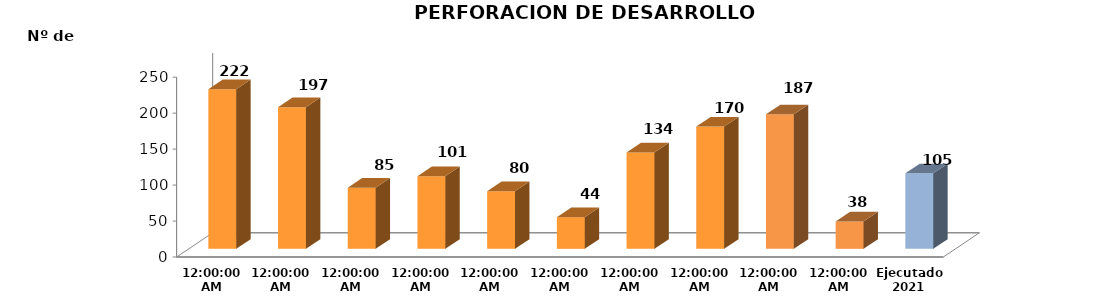
| Category | Series 0 |
|---|---|
| 2011 | 222 |
| 2012 | 197 |
| 2013 | 85 |
| 2014 | 101 |
| 2015 | 80 |
| 2016 | 44 |
| 2017 | 134 |
| 2018 | 170 |
| 2019 | 187 |
| 2020 | 38 |
| Ejecutado
2021 | 105 |